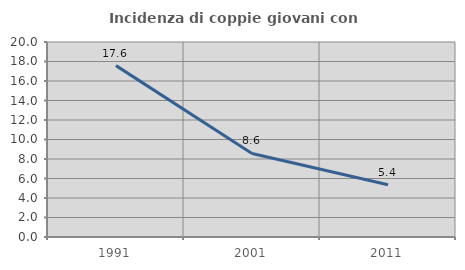
| Category | Incidenza di coppie giovani con figli |
|---|---|
| 1991.0 | 17.577 |
| 2001.0 | 8.567 |
| 2011.0 | 5.353 |